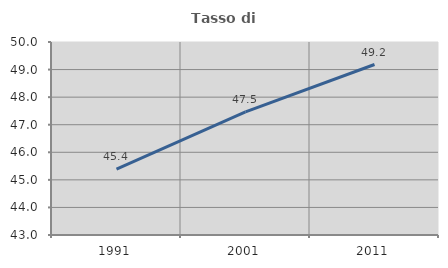
| Category | Tasso di occupazione   |
|---|---|
| 1991.0 | 45.393 |
| 2001.0 | 47.467 |
| 2011.0 | 49.183 |